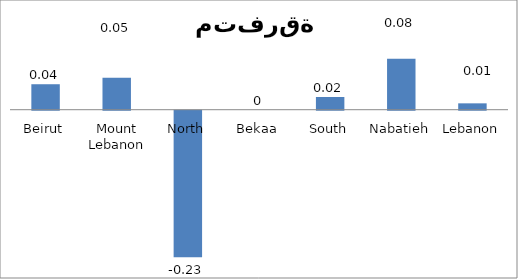
| Category | 12 |
|---|---|
| Beirut | 0.04 |
| Mount Lebanon | 0.05 |
| North | -0.23 |
| Bekaa | 0 |
| South | 0.02 |
| Nabatieh | 0.08 |
| Lebanon | 0.01 |